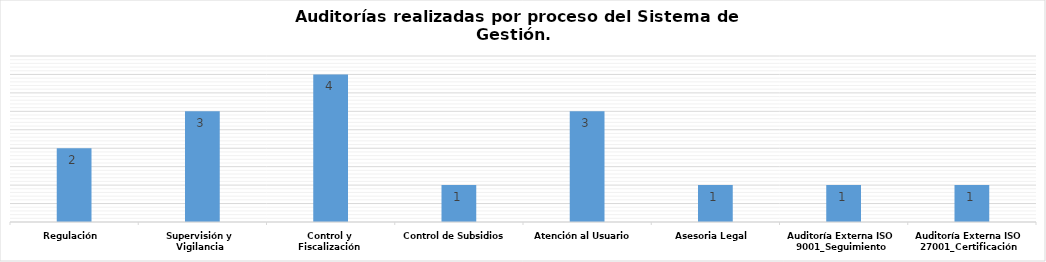
| Category | Total |
|---|---|
| Regulación | 2 |
| Supervisión y Vigilancia | 3 |
| Control y Fiscalización | 4 |
| Control de Subsidios | 1 |
| Atención al Usuario | 3 |
| Asesoria Legal | 1 |
| Auditoría Externa ISO 9001_Seguimiento | 1 |
| Auditoría Externa ISO 27001_Certificación | 1 |